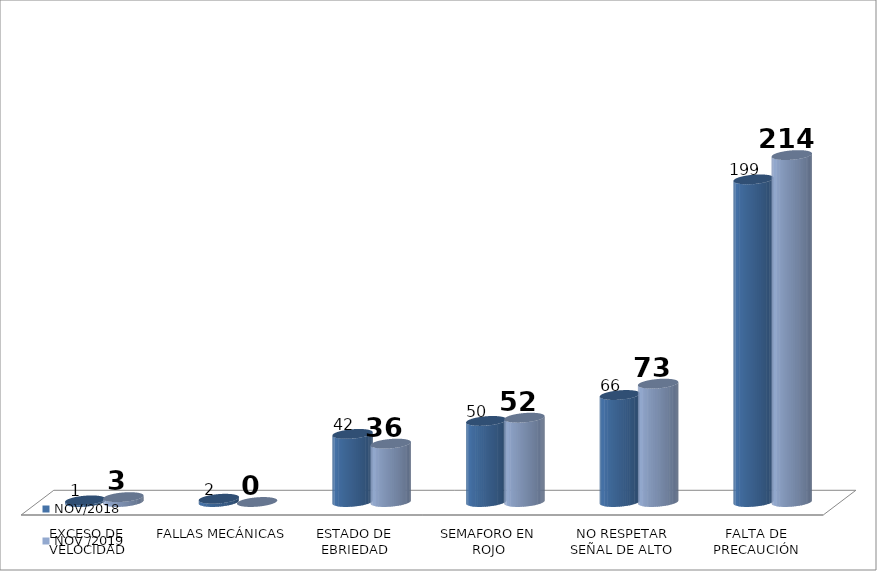
| Category | NOV/2018 | NOV /2019 |
|---|---|---|
| EXCESO DE VELOCIDAD | 1 | 3 |
| FALLAS MECÁNICAS | 2 | 0 |
| ESTADO DE EBRIEDAD | 42 | 36 |
| SEMAFORO EN ROJO | 50 | 52 |
| NO RESPETAR SEÑAL DE ALTO | 66 | 73 |
| FALTA DE PRECAUCIÓN | 199 | 214 |